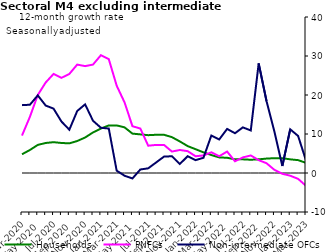
| Category | zero | Households | PNFCs | Non-intermediate OFCs |
|---|---|---|---|---|
| Mar-2020 | 0 | 4.8 | 9.6 | 17.4 |
| Apr-2020 | 0 | 5.9 | 14.4 | 17.5 |
| May-2020 | 0 | 7.2 | 20 | 19.9 |
| Jun-2020 | 0 | 7.7 | 23.2 | 17.3 |
| Jul-2020 | 0 | 7.9 | 25.4 | 16.5 |
| Aug-2020 | 0 | 7.7 | 24.4 | 13.2 |
| Sep-2020 | 0 | 7.6 | 25.4 | 11.1 |
| Oct-2020 | 0 | 8.2 | 27.8 | 15.9 |
| Nov-2020 | 0 | 9.1 | 27.4 | 17.6 |
| Dec-2020 | 0 | 10.4 | 27.8 | 13.4 |
| Jan-2021 | 0 | 11.4 | 30.2 | 11.6 |
| Feb-2021 | 0 | 12.2 | 29.2 | 11.4 |
| Mar-2021 | 0 | 12.2 | 22.4 | 0.6 |
| Apr-2021 | 0 | 11.7 | 18.1 | -0.7 |
| May-2021 | 0 | 10.1 | 12 | -1.4 |
| Jun-2021 | 0 | 9.9 | 11.4 | 0.9 |
| Jul-2021 | 0 | 9.7 | 7 | 1.2 |
| Aug-2021 | 0 | 9.8 | 7.2 | 2.7 |
| Sep-2021 | 0 | 9.8 | 7.2 | 4.2 |
| Oct-2021 | 0 | 9.2 | 5.5 | 4.3 |
| Nov-2021 | 0 | 8.1 | 5.9 | 2.3 |
| Dec-2021 | 0 | 6.9 | 5.6 | 4.3 |
| Jan-2022 | 0 | 6.1 | 4.3 | 3.3 |
| Feb-2022 | 0 | 5.3 | 4.5 | 3.9 |
| Mar-2022 | 0 | 4.6 | 5.3 | 9.6 |
| Apr-2022 | 0 | 4 | 4.3 | 8.6 |
| May-2022 | 0 | 3.9 | 5.5 | 11.3 |
| Jun-2022 | 0 | 3.5 | 3 | 10.2 |
| Jul-2022 | 0 | 3.5 | 4 | 11.7 |
| Aug-2022 | 0 | 3.4 | 4.5 | 10.9 |
| Sep-2022 | 0 | 3.5 | 3.3 | 28.1 |
| Oct-2022 | 0 | 3.7 | 2.5 | 18.4 |
| Nov-2022 | 0 | 3.8 | 0.8 | 10.6 |
| Dec-2022 | 0 | 3.8 | -0.2 | 1.8 |
| Jan-2023 | 0 | 3.5 | -0.7 | 11.2 |
| Feb-2023 | 0 | 3.3 | -1.5 | 9.5 |
| Mar-2023 | 0 | 2.6 | -3.3 | 3.2 |